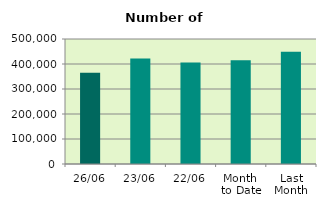
| Category | Series 0 |
|---|---|
| 26/06 | 364604 |
| 23/06 | 422050 |
| 22/06 | 406382 |
| Month 
to Date | 414695.667 |
| Last
Month | 449234.545 |